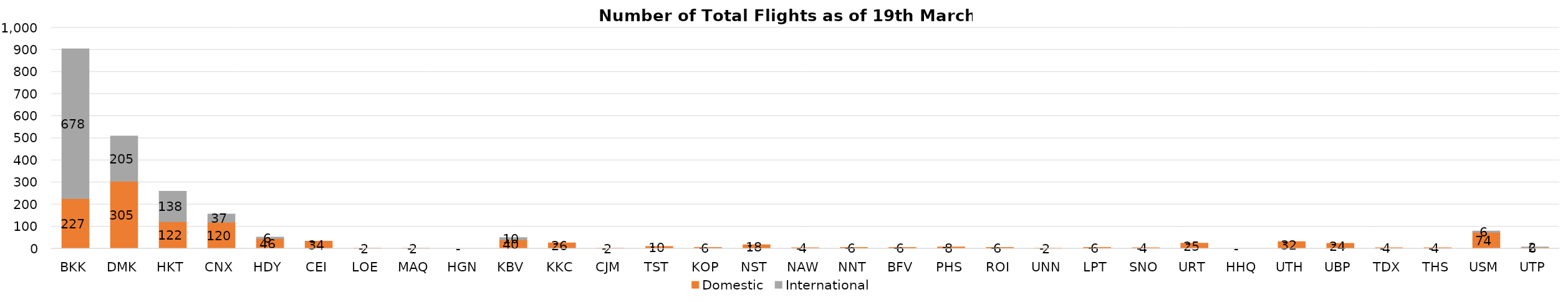
| Category | Domestic | International |
|---|---|---|
| BKK | 227 | 678 |
| DMK | 305 | 205 |
| HKT | 122 | 138 |
| CNX | 120 | 37 |
| HDY | 46 | 6 |
| CEI | 34 | 0 |
| LOE | 2 | 0 |
| MAQ | 2 | 0 |
| HGN | 0 | 0 |
| KBV | 40 | 10 |
| KKC | 26 | 0 |
| CJM | 2 | 0 |
| TST | 10 | 0 |
| KOP | 6 | 0 |
| NST | 18 | 0 |
| NAW | 4 | 0 |
| NNT | 6 | 0 |
| BFV | 6 | 0 |
| PHS | 8 | 0 |
| ROI | 6 | 0 |
| UNN | 2 | 0 |
| LPT | 6 | 0 |
| SNO | 4 | 0 |
| URT | 25 | 0 |
| HHQ | 0 | 0 |
| UTH | 32 | 0 |
| UBP | 24 | 0 |
| TDX | 4 | 0 |
| THS | 4 | 0 |
| USM | 74 | 6 |
| UTP | 6 | 2 |